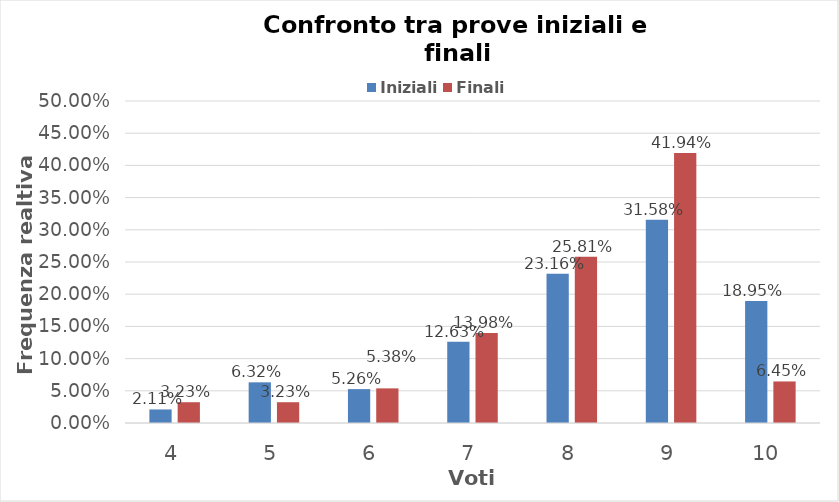
| Category | Iniziali | Finali |
|---|---|---|
| 4.0 | 0.021 | 0.032 |
| 5.0 | 0.063 | 0.032 |
| 6.0 | 0.053 | 0.054 |
| 7.0 | 0.126 | 0.14 |
| 8.0 | 0.232 | 0.258 |
| 9.0 | 0.316 | 0.419 |
| 10.0 | 0.189 | 0.065 |